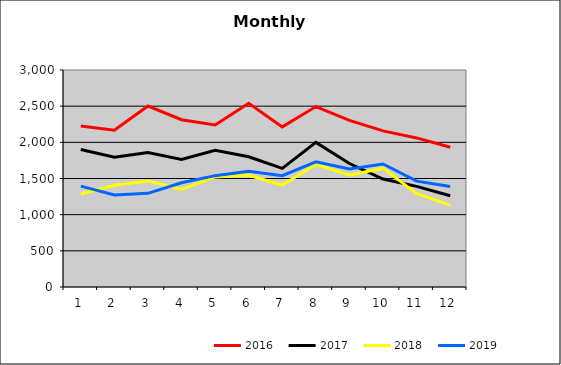
| Category | 2016 | 2017 | 2018 | 2019 |
|---|---|---|---|---|
| 0 | 2226.188 | 1900.859 | 1286.21 | 1394.576 |
| 1 | 2166.497 | 1795.105 | 1406.556 | 1272.617 |
| 2 | 2501.903 | 1859.386 | 1466.695 | 1295.231 |
| 3 | 2312.349 | 1764.013 | 1347.408 | 1441.267 |
| 4 | 2240.561 | 1891.399 | 1522.181 | 1539.379 |
| 5 | 2540.235 | 1800.236 | 1543.945 | 1598.892 |
| 6 | 2213.485 | 1640.121 | 1409.491 | 1538.112 |
| 7 | 2494.361 | 1999.331 | 1694.901 | 1729.426 |
| 8 | 2304.009 | 1706.874 | 1545.104 | 1631.933 |
| 9 | 2158.544 | 1492.036 | 1642.816 | 1701.214 |
| 10 | 2060.966 | 1390.86 | 1288.934 | 1463.951 |
| 11 | 1932.97 | 1261.902 | 1131.485 | 1390.399 |